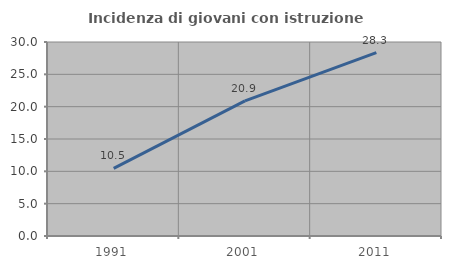
| Category | Incidenza di giovani con istruzione universitaria |
|---|---|
| 1991.0 | 10.455 |
| 2001.0 | 20.896 |
| 2011.0 | 28.346 |